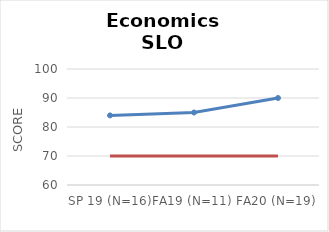
| Category | Series 0 | Series 1 |
|---|---|---|
| SP 19 (N=16) | 84 | 70 |
| FA19 (N=11) | 85 | 70 |
| FA20 (N=19) | 90 | 70 |